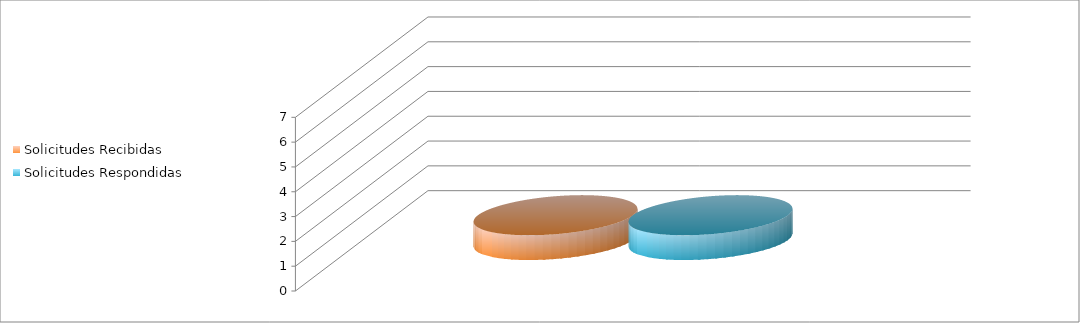
| Category | Solicitudes Recibidas | Solicitudes Respondidas |
|---|---|---|
| 0.0 | 1 | 1 |